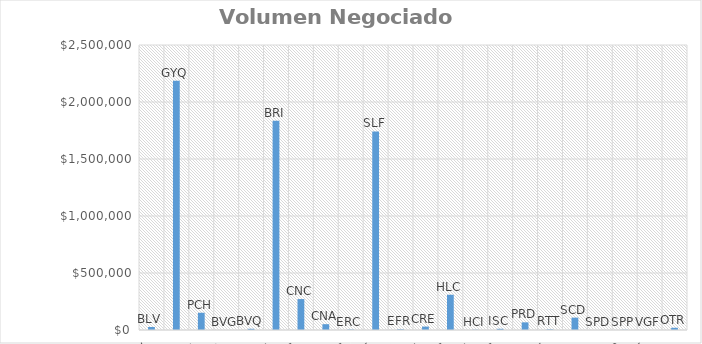
| Category | Volumen (USD) |
|---|---|
| BLV | 26604.1 |
| GYQ | 2187034.15 |
| PCH | 151246.5 |
| BVG | 0 |
| BVQ | 10650 |
| BRI | 1836000 |
| CNC | 271346.85 |
| CNA | 50989 |
| ERC | 3956 |
| SLF | 1742185.3 |
| EFR | 6240 |
| CRE | 29914.5 |
| HLC | 309138.93 |
| HCI | 2338.7 |
| ISC | 10650 |
| PRD | 67087.52 |
| RTT | 5239.4 |
| SCD | 108529.03 |
| SPD | 0 |
| SPP | 2146.25 |
| VGF | 0 |
| OTR | 19524.6 |